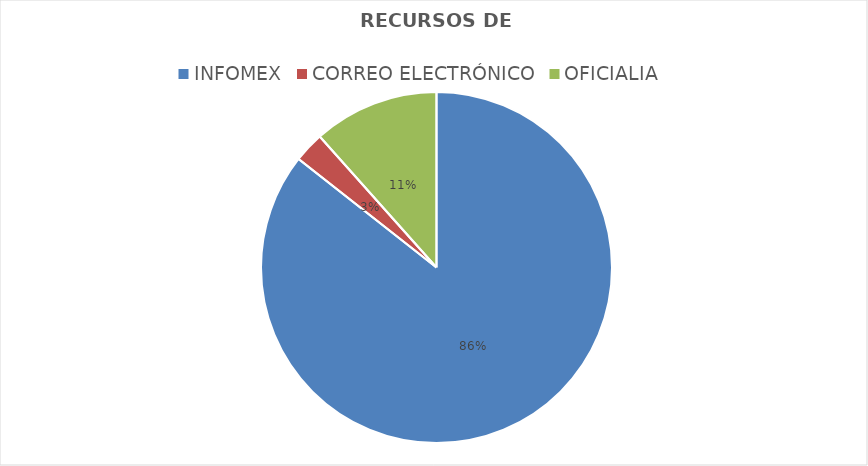
| Category | Series 0 |
|---|---|
| INFOMEX | 458 |
| CORREO ELECTRÓNICO | 15 |
| OFICIALIA | 62 |